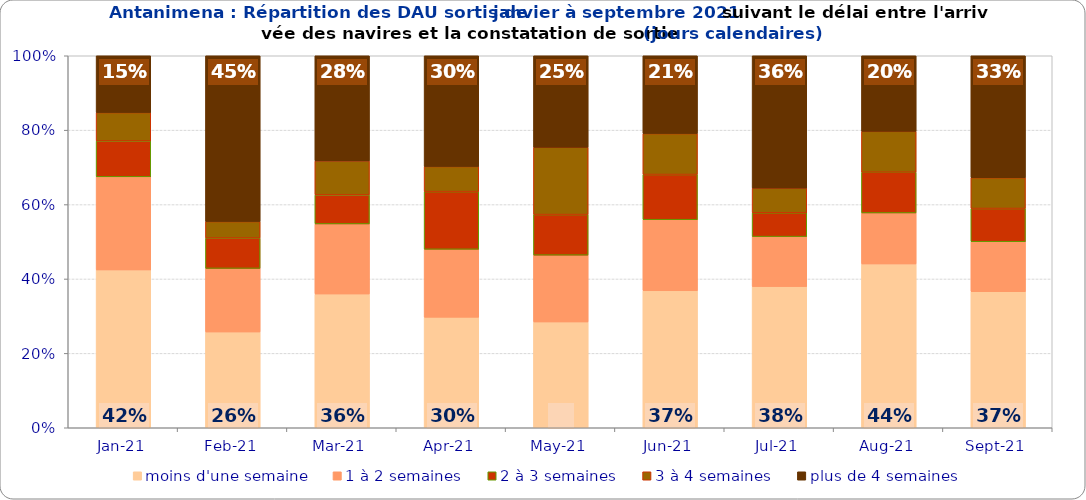
| Category | moins d'une semaine | 1 à 2 semaines | 2 à 3 semaines | 3 à 4 semaines | plus de 4 semaines |
|---|---|---|---|---|---|
| 2021-01-01 | 0.424 | 0.25 | 0.096 | 0.076 | 0.153 |
| 2021-02-01 | 0.257 | 0.171 | 0.081 | 0.044 | 0.446 |
| 2021-03-01 | 0.36 | 0.188 | 0.078 | 0.091 | 0.283 |
| 2021-04-01 | 0.297 | 0.183 | 0.155 | 0.068 | 0.298 |
| 2021-05-01 | 0.284 | 0.18 | 0.109 | 0.181 | 0.246 |
| 2021-06-01 | 0.368 | 0.191 | 0.122 | 0.11 | 0.209 |
| 2021-07-01 | 0.379 | 0.134 | 0.064 | 0.067 | 0.356 |
| 2021-08-01 | 0.44 | 0.137 | 0.109 | 0.11 | 0.203 |
| 2021-09-01 | 0.366 | 0.134 | 0.089 | 0.083 | 0.328 |